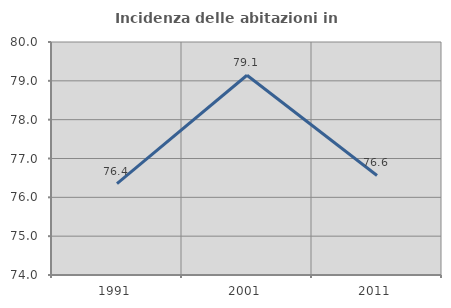
| Category | Incidenza delle abitazioni in proprietà  |
|---|---|
| 1991.0 | 76.355 |
| 2001.0 | 79.144 |
| 2011.0 | 76.562 |